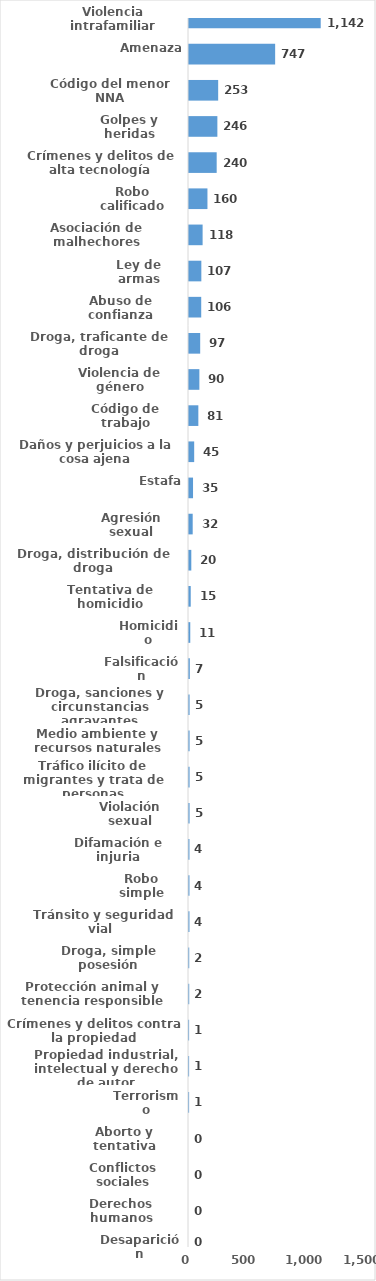
| Category | Series 0 |
|---|---|
| Violencia intrafamiliar | 1142 |
| Amenaza | 747 |
| Código del menor NNA | 253 |
| Golpes y heridas | 246 |
| Crímenes y delitos de alta tecnología | 240 |
| Robo calificado | 160 |
| Asociación de malhechores | 118 |
| Ley de armas | 107 |
| Abuso de confianza | 106 |
| Droga, traficante de droga | 97 |
| Violencia de género | 90 |
| Código de trabajo | 81 |
| Daños y perjuicios a la cosa ajena | 45 |
| Estafa | 35 |
| Agresión sexual | 32 |
| Droga, distribución de droga | 20 |
| Tentativa de homicidio | 15 |
| Homicidio | 11 |
| Falsificación | 7 |
| Droga, sanciones y circunstancias agravantes | 5 |
| Medio ambiente y recursos naturales | 5 |
| Tráfico ilícito de migrantes y trata de personas | 5 |
| Violación sexual | 5 |
| Difamación e injuria | 4 |
| Robo simple | 4 |
| Tránsito y seguridad vial  | 4 |
| Droga, simple posesión | 2 |
| Protección animal y tenencia responsible | 2 |
| Crímenes y delitos contra la propiedad | 1 |
| Propiedad industrial, intelectual y derecho de autor | 1 |
| Terrorismo | 1 |
| Aborto y tentativa | 0 |
| Conflictos sociales | 0 |
| Derechos humanos | 0 |
| Desaparición | 0 |